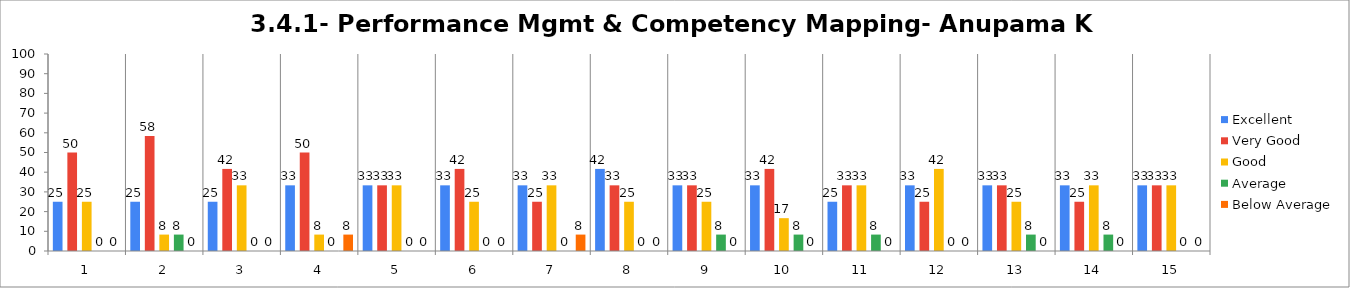
| Category | Excellent | Very Good | Good | Average | Below Average |
|---|---|---|---|---|---|
| 0 | 25 | 50 | 25 | 0 | 0 |
| 1 | 25 | 58.333 | 8.333 | 8.333 | 0 |
| 2 | 25 | 41.667 | 33.333 | 0 | 0 |
| 3 | 33.333 | 50 | 8.333 | 0 | 8.333 |
| 4 | 33.333 | 33.333 | 33.333 | 0 | 0 |
| 5 | 33.333 | 41.667 | 25 | 0 | 0 |
| 6 | 33.333 | 25 | 33.333 | 0 | 8.333 |
| 7 | 41.667 | 33.333 | 25 | 0 | 0 |
| 8 | 33.333 | 33.333 | 25 | 8.333 | 0 |
| 9 | 33.333 | 41.667 | 16.667 | 8.333 | 0 |
| 10 | 25 | 33.333 | 33.333 | 8.333 | 0 |
| 11 | 33.333 | 25 | 41.667 | 0 | 0 |
| 12 | 33.333 | 33.333 | 25 | 8.333 | 0 |
| 13 | 33.333 | 25 | 33.333 | 8.333 | 0 |
| 14 | 33.333 | 33.333 | 33.333 | 0 | 0 |